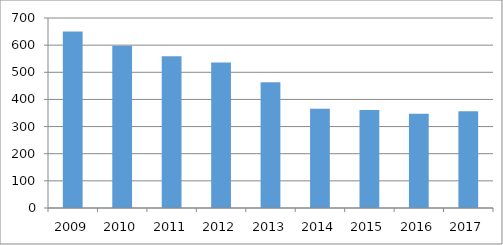
| Category | Series 0 |
|---|---|
| 2009.0 | 650 |
| 2010.0 | 598 |
| 2011.0 | 559 |
| 2012.0 | 536 |
| 2013.0 | 463 |
| 2014.0 | 366 |
| 2015.0 | 361 |
| 2016.0 | 347 |
| 2017.0 | 356 |